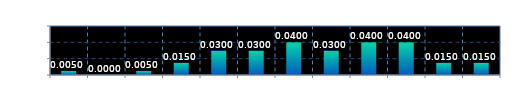
| Category | Series 0 |
|---|---|
| 0 | 0.005 |
| 1 | 0 |
| 2 | 0.005 |
| 3 | 0.015 |
| 4 | 0.03 |
| 5 | 0.03 |
| 6 | 0.04 |
| 7 | 0.03 |
| 8 | 0.04 |
| 9 | 0.04 |
| 10 | 0.015 |
| 11 | 0.015 |